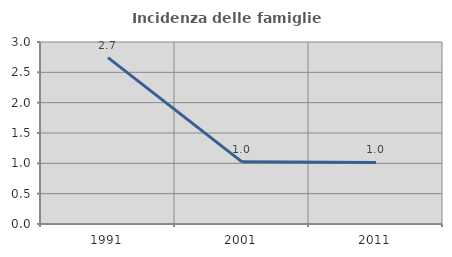
| Category | Incidenza delle famiglie numerose |
|---|---|
| 1991.0 | 2.742 |
| 2001.0 | 1.024 |
| 2011.0 | 1.014 |